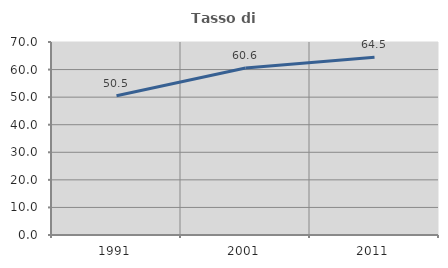
| Category | Tasso di occupazione   |
|---|---|
| 1991.0 | 50.486 |
| 2001.0 | 60.553 |
| 2011.0 | 64.488 |